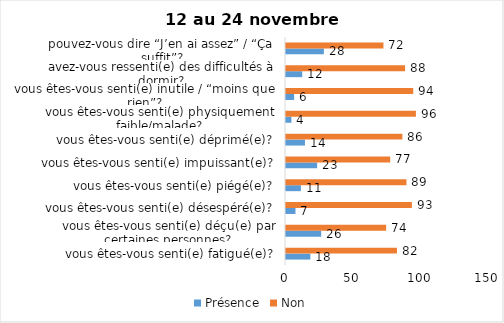
| Category | Présence | Non |
|---|---|---|
| vous êtes-vous senti(e) fatigué(e)? | 18 | 82 |
| vous êtes-vous senti(e) déçu(e) par certaines personnes? | 26 | 74 |
| vous êtes-vous senti(e) désespéré(e)? | 7 | 93 |
| vous êtes-vous senti(e) piégé(e)? | 11 | 89 |
| vous êtes-vous senti(e) impuissant(e)? | 23 | 77 |
| vous êtes-vous senti(e) déprimé(e)? | 14 | 86 |
| vous êtes-vous senti(e) physiquement faible/malade? | 4 | 96 |
| vous êtes-vous senti(e) inutile / “moins que rien”? | 6 | 94 |
| avez-vous ressenti(e) des difficultés à dormir? | 12 | 88 |
| pouvez-vous dire “J’en ai assez” / “Ça suffit”? | 28 | 72 |